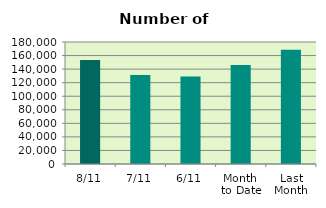
| Category | Series 0 |
|---|---|
| 8/11 | 153582 |
| 7/11 | 131212 |
| 6/11 | 129184 |
| Month 
to Date | 146107 |
| Last
Month | 168717.043 |